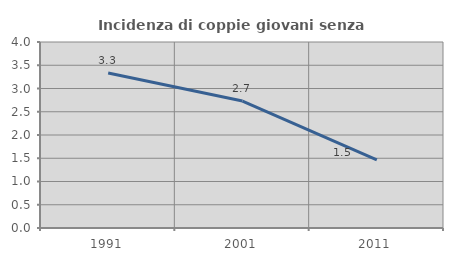
| Category | Incidenza di coppie giovani senza figli |
|---|---|
| 1991.0 | 3.333 |
| 2001.0 | 2.73 |
| 2011.0 | 1.466 |